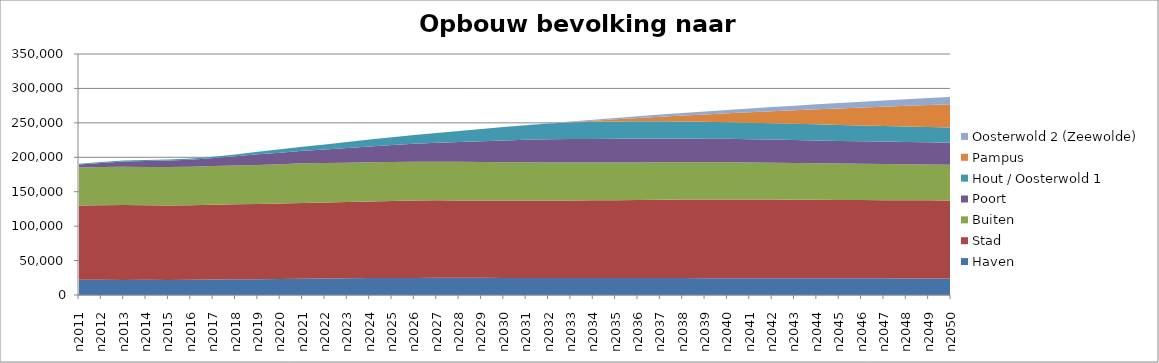
| Category | Haven | Stad | Buiten | Poort | Hout / Oosterwold 1 | Pampus | Oosterwold 2 (Zeewolde) |
|---|---|---|---|---|---|---|---|
| n2011 | 22062 | 108063 | 54994 | 4228 | 1415 | 0 | 0 |
| n2012 | 22052 | 108273 | 55387 | 6023 | 1417 | 0 | 0 |
| n2013 | 21927 | 108615 | 55679 | 7555 | 1411 | 0 | 0 |
| n2014 | 22009 | 108424 | 55617 | 8514 | 1461 | 0 | 0 |
| n2015 | 21943 | 108170 | 55818 | 9489 | 1509 | 0 | 0 |
| n2016 | 22163 | 108071 | 55950 | 10380 | 1735 | 0 | 0 |
| n2017 | 22476 | 108608 | 56124 | 11625 | 2084 | 0 | 0 |
| n2018 | 22795 | 108822 | 56328 | 13431 | 2652 | 0 | 0 |
| n2019 | 22863 | 109280 | 56763 | 15350 | 3639 | 0 | 0 |
| n2020 | 23263 | 109778 | 56954 | 16767 | 5055 | 0 | 0 |
| n2021 | 23539 | 110125 | 57506 | 18171 | 6101 | 0 | 0 |
| n2022 | 23875 | 110324 | 57486 | 19689 | 7341 | 0 | 0 |
| n2023 | 24285 | 110697 | 57229 | 21416 | 8586 | 0 | 0 |
| n2024 | 24550 | 111391 | 56898 | 22976 | 9976 | 0 | 0 |
| n2025 | 24673 | 112021 | 56640 | 24510 | 11341 | 0 | 0 |
| n2026 | 24768 | 112479 | 56390 | 25944 | 12725 | 0 | 0 |
| n2027 | 24871 | 112604 | 56185 | 27404 | 14232 | 0 | 0 |
| n2028 | 24899 | 112511 | 55978 | 28918 | 15977 | 0 | 0 |
| n2029 | 24881 | 112472 | 55717 | 30305 | 17714 | 0 | 0 |
| n2030 | 24792 | 112500 | 55556 | 31648 | 19434 | 0 | 0 |
| n2031 | 24769 | 112577 | 55346 | 32696 | 21152 | 0 | 181 |
| n2032 | 24703 | 112661 | 55124 | 33602 | 22804 | 0 | 521 |
| n2033 | 24674 | 112723 | 55000 | 34006 | 24161 | 446 | 1033 |
| n2034 | 24648 | 112837 | 54802 | 34400 | 24837 | 1545 | 1543 |
| n2035 | 24606 | 113157 | 54691 | 34454 | 25090 | 3071 | 2065 |
| n2036 | 24584 | 113457 | 54534 | 34542 | 25086 | 4803 | 2579 |
| n2037 | 24522 | 113768 | 54386 | 34591 | 24909 | 6709 | 3091 |
| n2038 | 24509 | 114037 | 54200 | 34492 | 24708 | 8737 | 3613 |
| n2039 | 24465 | 114238 | 54025 | 34303 | 24497 | 10786 | 4248 |
| n2040 | 24420 | 114417 | 53863 | 34085 | 24258 | 12836 | 4878 |
| n2041 | 24360 | 114363 | 53666 | 33860 | 24044 | 15098 | 5505 |
| n2042 | 24332 | 114262 | 53434 | 33665 | 23811 | 17351 | 6114 |
| n2043 | 24285 | 114123 | 53221 | 33446 | 23587 | 19606 | 6717 |
| n2044 | 24238 | 114012 | 52977 | 33249 | 23354 | 21834 | 7288 |
| n2045 | 24213 | 113842 | 52762 | 33014 | 23132 | 24052 | 7834 |
| n2046 | 24178 | 113722 | 52566 | 32869 | 22914 | 26059 | 8392 |
| n2047 | 24149 | 113627 | 52327 | 32691 | 22734 | 28037 | 8934 |
| n2048 | 24125 | 113500 | 52106 | 32537 | 22526 | 29978 | 9464 |
| n2049 | 24119 | 113366 | 51889 | 32353 | 22339 | 31895 | 9980 |
| n2050 | 24084 | 113219 | 51684 | 32205 | 22151 | 33784 | 10488 |